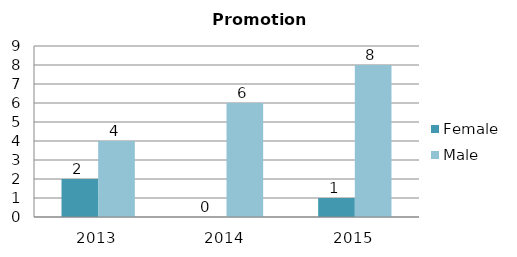
| Category | Female | Male |
|---|---|---|
| 2013.0 | 2 | 4 |
| 2014.0 | 0 | 6 |
| 2015.0 | 1 | 8 |